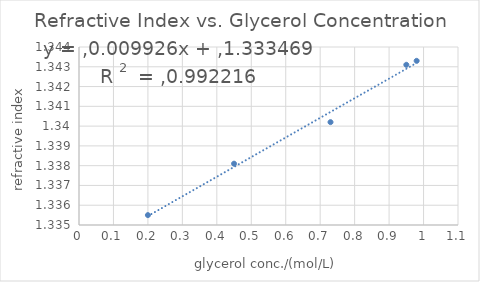
| Category | refractive index |
|---|---|
| 0.2 | 1.336 |
| 0.45 | 1.338 |
| 0.73 | 1.34 |
| 0.95 | 1.343 |
| 0.98 | 1.343 |